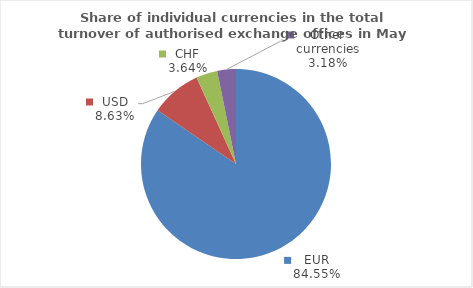
| Category | Series 0 |
|---|---|
| EUR | 84.548 |
| USD | 8.632 |
| CHF | 3.639 |
| Other currencies | 3.181 |